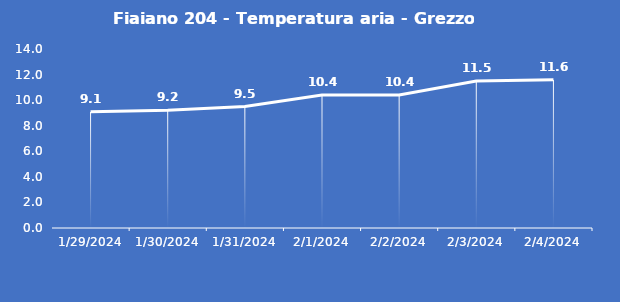
| Category | Fiaiano 204 - Temperatura aria - Grezzo (°C) |
|---|---|
| 1/29/24 | 9.1 |
| 1/30/24 | 9.2 |
| 1/31/24 | 9.5 |
| 2/1/24 | 10.4 |
| 2/2/24 | 10.4 |
| 2/3/24 | 11.5 |
| 2/4/24 | 11.6 |